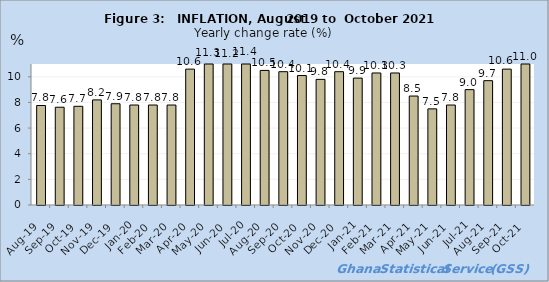
| Category |      |
|---|---|
| 2019-08-01 | 7.764 |
| 2019-09-01 | 7.627 |
| 2019-10-01 | 7.7 |
| 2019-11-01 | 8.2 |
| 2019-12-01 | 7.9 |
| 2020-01-01 | 7.8 |
| 2020-02-01 | 7.8 |
| 2020-03-01 | 7.8 |
| 2020-04-01 | 10.6 |
| 2020-05-01 | 11.3 |
| 2020-06-01 | 11.2 |
| 2020-07-01 | 11.4 |
| 2020-08-01 | 10.5 |
| 2020-09-01 | 10.4 |
| 2020-10-01 | 10.1 |
| 2020-11-01 | 9.8 |
| 2020-12-01 | 10.4 |
| 2021-01-01 | 9.9 |
| 2021-02-01 | 10.3 |
| 2021-03-01 | 10.3 |
| 2021-04-01 | 8.5 |
| 2021-05-01 | 7.5 |
| 2021-06-01 | 7.8 |
| 2021-07-01 | 9 |
| 2021-08-01 | 9.7 |
| 2021-09-01 | 10.6 |
| 2021-10-01 | 11 |